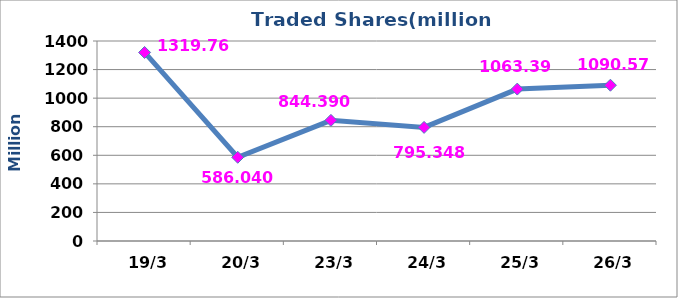
| Category | عدد الاسهم |
|---|---|
|  19/3 | 1319763696 |
|  20/3 | 586040127 |
|  23/3 | 844390432 |
|  24/3 | 795347703 |
|  25/3 | 1063393212 |
|  26/3 | 1090571055 |